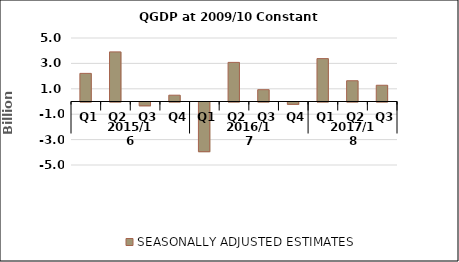
| Category | SEASONALLY ADJUSTED ESTIMATES |
|---|---|
| 0 | 2.214 |
| 1 | 3.905 |
| 2 | -0.3 |
| 3 | 0.496 |
| 4 | -3.913 |
| 5 | 3.079 |
| 6 | 0.931 |
| 7 | -0.185 |
| 8 | 3.378 |
| 9 | 1.634 |
| 10 | 1.279 |